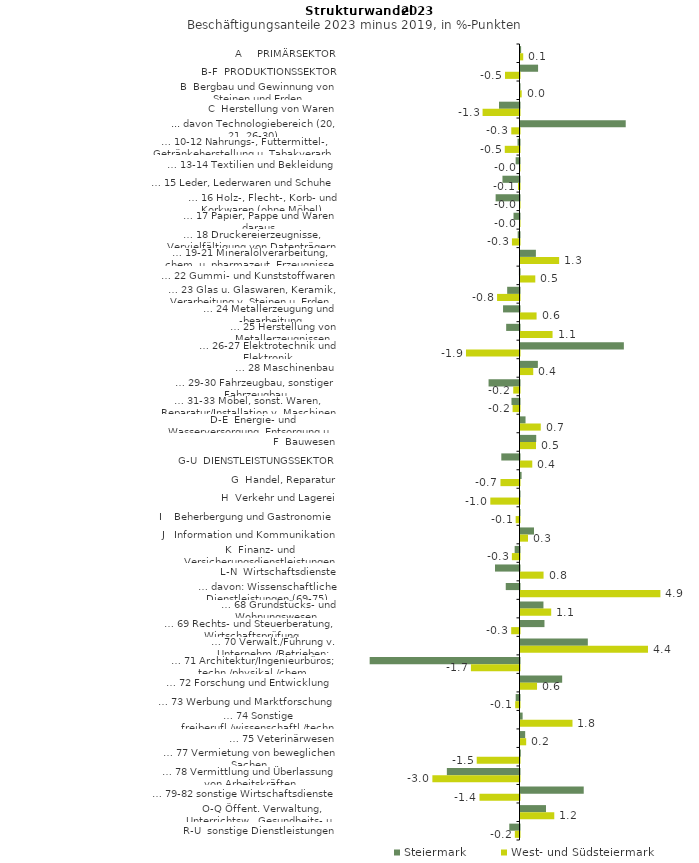
| Category | Steiermark | West- und Südsteiermark |
|---|---|---|
| A     PRIMÄRSEKTOR | 0.022 | 0.095 |
| B-F  PRODUKTIONSSEKTOR | 0.612 | -0.504 |
| B  Bergbau und Gewinnung von Steinen und Erden | -0.009 | 0.041 |
| C  Herstellung von Waren | -0.714 | -1.284 |
| ... davon Technologiebereich (20, 21, 26-30) | 3.66 | -0.286 |
| … 10-12 Nahrungs-, Futtermittel-, Getränkeherstellung u. Tabakverarb. | -0.068 | -0.512 |
| … 13-14 Textilien und Bekleidung | -0.134 | -0.017 |
| … 15 Leder, Lederwaren und Schuhe | -0.593 | -0.051 |
| … 16 Holz-, Flecht-, Korb- und Korkwaren (ohne Möbel)  | -0.83 | -0.014 |
| … 17 Papier, Pappe und Waren daraus  | -0.208 | -0.015 |
| … 18 Druckereierzeugnisse, Vervielfältigung von Datenträgern | -0.063 | -0.263 |
| … 19-21 Mineralölverarbeitung, chem. u. pharmazeut. Erzeugnisse | 0.535 | 1.344 |
| … 22 Gummi- und Kunststoffwaren | -0.02 | 0.515 |
| … 23 Glas u. Glaswaren, Keramik, Verarbeitung v. Steinen u. Erden  | -0.429 | -0.781 |
| … 24 Metallerzeugung und -bearbeitung | -0.572 | 0.559 |
| … 25 Herstellung von Metallerzeugnissen  | -0.464 | 1.115 |
| … 26-27 Elektrotechnik und Elektronik | 3.595 | -1.862 |
| … 28 Maschinenbau | 0.604 | 0.443 |
| … 29-30 Fahrzeugbau, sonstiger Fahrzeugbau | -1.076 | -0.218 |
| … 31-33 Möbel, sonst. Waren, Reparatur/Installation v. Maschinen | -0.279 | -0.241 |
| D-E  Energie- und Wasserversorgung, Entsorgung u. Rückgewinnung | 0.175 | 0.705 |
| F  Bauwesen | 0.547 | 0.538 |
| G-U  DIENSTLEISTUNGSSEKTOR | -0.633 | 0.41 |
| G  Handel, Reparatur | 0.038 | -0.662 |
| H  Verkehr und Lagerei | -0.011 | -1.015 |
| I    Beherbergung und Gastronomie | -0.007 | -0.133 |
| J   Information und Kommunikation | 0.471 | 0.262 |
| K  Finanz- und Versicherungsdienstleistungen | -0.168 | -0.265 |
| L-N  Wirtschaftsdienste | -0.853 | 0.802 |
| … davon: Wissenschaftliche Dienstleistungen (69-75) | -0.478 | 4.866 |
| … 68 Grundstücks- und Wohnungswesen  | 0.798 | 1.068 |
| … 69 Rechts- und Steuerberatung, Wirtschaftsprüfung | 0.834 | -0.289 |
| … 70 Verwalt./Führung v. Unternehm./Betrieben; Unternehmensberat. | 2.342 | 4.434 |
| … 71 Architektur/Ingenieurbüros; techn./physikal./chem. Untersuchung | -5.212 | -1.69 |
| … 72 Forschung und Entwicklung  | 1.449 | 0.575 |
| … 73 Werbung und Marktforschung | -0.133 | -0.15 |
| … 74 Sonstige freiberufl./wissenschaftl./techn. Tätigkeiten | 0.074 | 1.809 |
| … 75 Veterinärwesen | 0.163 | 0.198 |
| … 77 Vermietung von beweglichen Sachen  | 0.011 | -1.488 |
| … 78 Vermittlung und Überlassung von Arbeitskräften | -2.527 | -3.031 |
| … 79-82 sonstige Wirtschaftsdienste | 2.199 | -1.392 |
| O-Q Öffent. Verwaltung, Unterrichtsw., Gesundheits- u. Sozialwesen | 0.886 | 1.175 |
| R-U  sonstige Dienstleistungen | -0.355 | -0.162 |